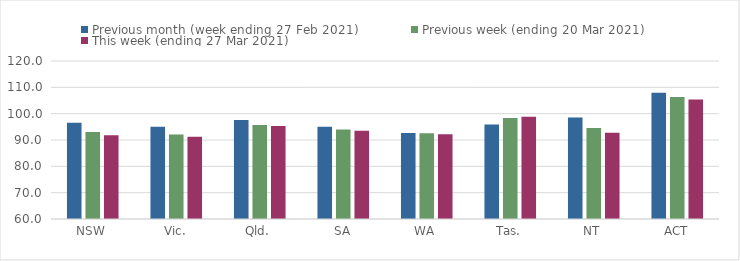
| Category | Previous month (week ending 27 Feb 2021) | Previous week (ending 20 Mar 2021) | This week (ending 27 Mar 2021) |
|---|---|---|---|
| NSW | 96.52 | 93.01 | 91.78 |
| Vic. | 95.03 | 92.13 | 91.25 |
| Qld. | 97.62 | 95.7 | 95.33 |
| SA | 95 | 94 | 93.52 |
| WA | 92.63 | 92.59 | 92.17 |
| Tas. | 95.9 | 98.39 | 98.82 |
| NT | 98.54 | 94.53 | 92.77 |
| ACT | 107.94 | 106.35 | 105.41 |